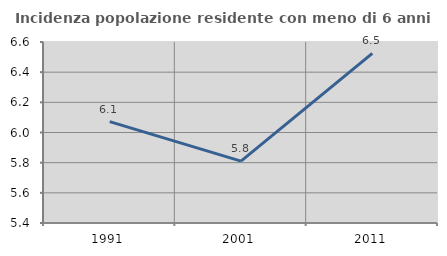
| Category | Incidenza popolazione residente con meno di 6 anni |
|---|---|
| 1991.0 | 6.072 |
| 2001.0 | 5.81 |
| 2011.0 | 6.525 |